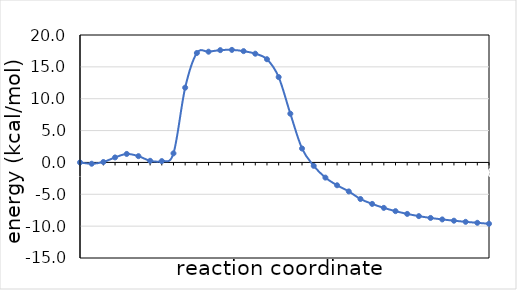
| Category | Series 0 |
|---|---|
| 1.0 | 0 |
| 2.0 | -0.206 |
| 3.0 | 0.068 |
| 4.0 | 0.783 |
| 5.0 | 1.334 |
| 6.0 | 0.984 |
| 7.0 | 0.255 |
| 8.0 | 0.209 |
| 9.0 | 1.427 |
| 10.0 | 11.735 |
| 11.0 | 17.173 |
| 12.0 | 17.379 |
| 13.0 | 17.623 |
| 14.0 | 17.664 |
| 15.0 | 17.468 |
| 16.0 | 17.065 |
| 17.0 | 16.195 |
| 18.0 | 13.397 |
| 19.0 | 7.646 |
| 20.0 | 2.187 |
| 21.0 | -0.536 |
| 22.0 | -2.382 |
| 23.0 | -3.585 |
| 24.0 | -4.554 |
| 25.0 | -5.739 |
| 26.0 | -6.51 |
| 27.0 | -7.132 |
| 28.0 | -7.646 |
| 29.0 | -8.08 |
| 30.0 | -8.429 |
| 31.0 | -8.712 |
| 32.0 | -8.946 |
| 33.0 | -9.145 |
| 34.0 | -9.324 |
| 35.0 | -9.476 |
| 36.0 | -9.628 |